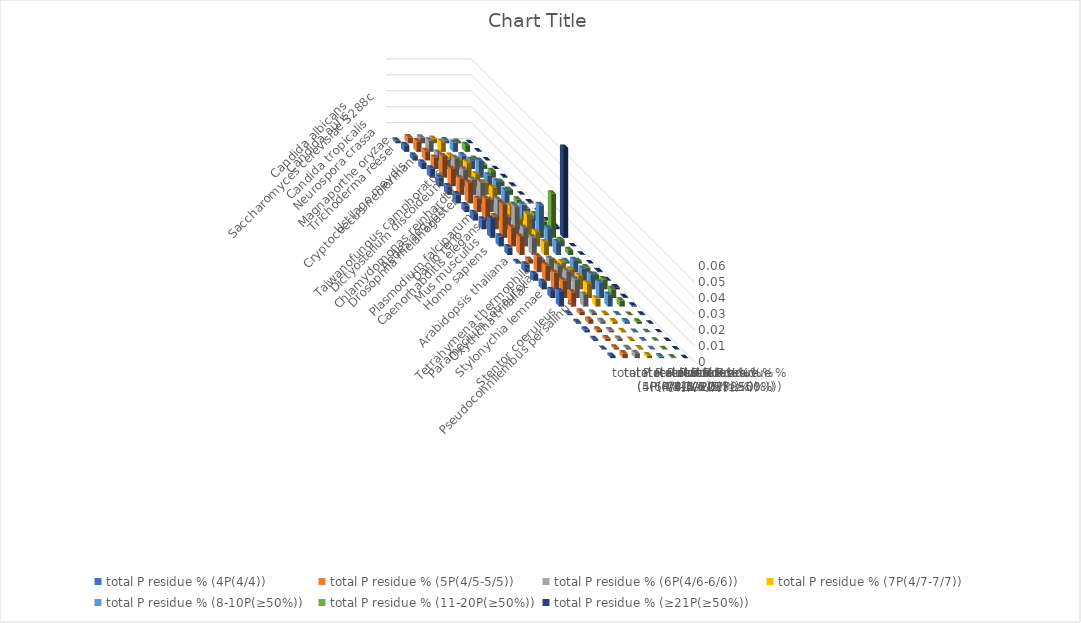
| Category | total P residue % (4P(4/4)) | total P residue % (5P(4/5-5/5)) | total P residue % (6P(4/6-6/6)) | total P residue % (7P(4/7-7/7)) | total P residue % (8-10P(≥50%)) | total P residue % (11-20P(≥50%)) | total P residue % (≥21P(≥50%)) |
|---|---|---|---|---|---|---|---|
| Saccharomyces cerevisiae S288c | 0.002 | 0.004 | 0.003 | 0.003 | 0.002 | 0.001 | 0 |
| Candida albicans | 0.004 | 0.007 | 0.007 | 0.006 | 0.006 | 0.004 | 0 |
| Candida auris | 0.003 | 0.006 | 0.005 | 0.003 | 0.003 | 0.001 | 0 |
| Candida tropicalis | 0.004 | 0.007 | 0.006 | 0.006 | 0.006 | 0.003 | 0 |
| Neurospora crassa | 0.006 | 0.014 | 0.012 | 0.009 | 0.01 | 0.004 | 0 |
| Magnaporthe oryzae | 0.005 | 0.011 | 0.011 | 0.007 | 0.007 | 0.003 | 0 |
| Trichoderma reesei | 0.005 | 0.01 | 0.009 | 0.008 | 0.008 | 0.003 | 0 |
| Cryptococcus neoformans | 0.006 | 0.013 | 0.013 | 0.01 | 0.008 | 0.002 | 0.001 |
| Ustilago maydis | 0.004 | 0.008 | 0.008 | 0.005 | 0.004 | 0.002 | 0 |
| Taiwanofungus camphoratus | 0.005 | 0.014 | 0.013 | 0.009 | 0.01 | 0.004 | 0 |
| Dictyostelium discoideum | 0.006 | 0.008 | 0.008 | 0.006 | 0.007 | 0.005 | 0.002 |
| Chlamydomonas reinhardtii | 0.012 | 0.021 | 0.019 | 0.015 | 0.021 | 0.028 | 0.056 |
| Drosophila melanogaster | 0.006 | 0.012 | 0.012 | 0.009 | 0.011 | 0.004 | 0 |
| Aedes aegypti | 0.005 | 0.011 | 0.011 | 0.008 | 0.008 | 0.003 | 0 |
| Plasmodium falciparum | 0.001 | 0.002 | 0.002 | 0.002 | 0.001 | 0.002 | 0 |
| Caenorhabditis elegans | 0.005 | 0.01 | 0.008 | 0.006 | 0.007 | 0.003 | 0.001 |
| Danio rerio | 0.004 | 0.009 | 0.009 | 0.007 | 0.008 | 0.004 | 0 |
| Mus musculus | 0.005 | 0.01 | 0.011 | 0.008 | 0.009 | 0.006 | 0.001 |
| Homo sapiens | 0.005 | 0.011 | 0.012 | 0.009 | 0.01 | 0.005 | 0 |
| Arabidopsis thaliana | 0.01 | 0.009 | 0.007 | 0.005 | 0.007 | 0.004 | 0.001 |
| Tetrahymena thermophila | 0.001 | 0.002 | 0.001 | 0.001 | 0 | 0 | 0 |
| Paramecium tetraurelia | 0.001 | 0.002 | 0.002 | 0.001 | 0.002 | 0.001 | 0 |
| Oxytricha trifallax | 0.002 | 0.002 | 0.001 | 0.001 | 0 | 0 | 0 |
| Stylonychia lemnae | 0.001 | 0.002 | 0.001 | 0.001 | 0 | 0 | 0 |
| Pseudocohnilembus persalinus | 0 | 0.001 | 0.001 | 0.001 | 0 | 0 | 0 |
| Stentor coeruleus | 0.001 | 0.003 | 0.003 | 0.002 | 0.001 | 0 | 0 |